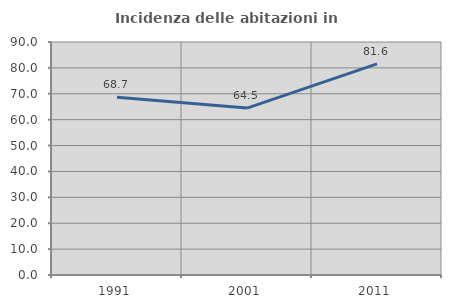
| Category | Incidenza delle abitazioni in proprietà  |
|---|---|
| 1991.0 | 68.702 |
| 2001.0 | 64.474 |
| 2011.0 | 81.57 |